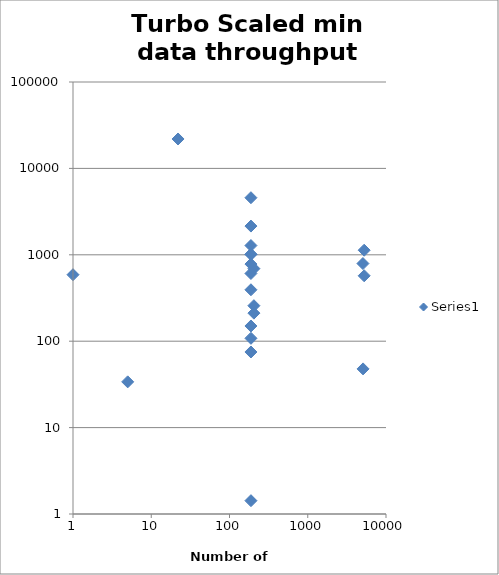
| Category | Series 0 |
|---|---|
| 5263.0 | 1130 |
| 5075.0 | 792 |
| 5263.0 | 571.846 |
| 205.0 | 691.7 |
| 188.0 | 1013 |
| 188.0 | 781.2 |
| 188.0 | 393.785 |
| 205.0 | 257.677 |
| 188.0 | 1.426 |
| 5092.0 | 47.8 |
| 205.0 | 211.2 |
| 188.0 | 607.611 |
| 188.0 | 4578.923 |
| 22.0 | 21900 |
| 188.0 | 2150 |
| 188.0 | 1280 |
| 188.0 | 1013 |
| 188.0 | 150 |
| 188.0 | 108 |
| 188.0 | 75 |
| 5.0 | 33.846 |
| 1.0 | 588.462 |